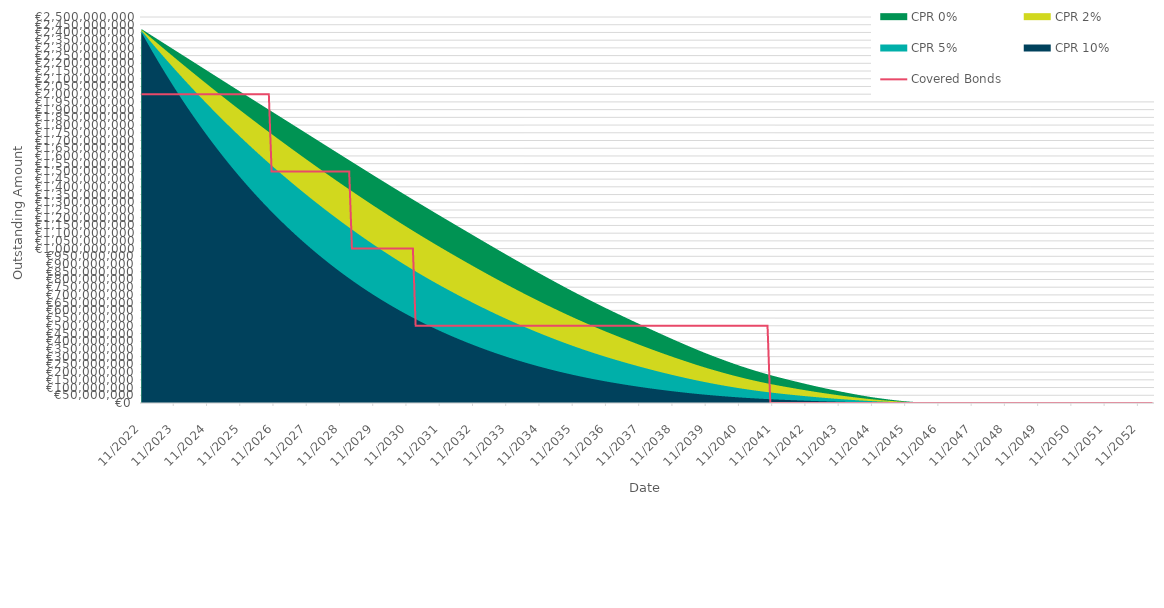
| Category | Covered Bonds |
|---|---|
| 2022-11-30 | 2000000000 |
| 2022-12-31 | 2000000000 |
| 2023-01-31 | 2000000000 |
| 2023-02-28 | 2000000000 |
| 2023-03-31 | 2000000000 |
| 2023-04-30 | 2000000000 |
| 2023-05-31 | 2000000000 |
| 2023-06-30 | 2000000000 |
| 2023-07-31 | 2000000000 |
| 2023-08-31 | 2000000000 |
| 2023-09-30 | 2000000000 |
| 2023-10-31 | 2000000000 |
| 2023-11-30 | 2000000000 |
| 2023-12-31 | 2000000000 |
| 2024-01-31 | 2000000000 |
| 2024-02-29 | 2000000000 |
| 2024-03-31 | 2000000000 |
| 2024-04-30 | 2000000000 |
| 2024-05-31 | 2000000000 |
| 2024-06-30 | 2000000000 |
| 2024-07-31 | 2000000000 |
| 2024-08-31 | 2000000000 |
| 2024-09-30 | 2000000000 |
| 2024-10-31 | 2000000000 |
| 2024-11-30 | 2000000000 |
| 2024-12-31 | 2000000000 |
| 2025-01-31 | 2000000000 |
| 2025-02-28 | 2000000000 |
| 2025-03-31 | 2000000000 |
| 2025-04-30 | 2000000000 |
| 2025-05-31 | 2000000000 |
| 2025-06-30 | 2000000000 |
| 2025-07-31 | 2000000000 |
| 2025-08-31 | 2000000000 |
| 2025-09-30 | 2000000000 |
| 2025-10-31 | 2000000000 |
| 2025-11-30 | 2000000000 |
| 2025-12-31 | 2000000000 |
| 2026-01-31 | 2000000000 |
| 2026-02-28 | 2000000000 |
| 2026-03-31 | 2000000000 |
| 2026-04-30 | 2000000000 |
| 2026-05-31 | 2000000000 |
| 2026-06-30 | 2000000000 |
| 2026-07-31 | 2000000000 |
| 2026-08-31 | 2000000000 |
| 2026-09-30 | 2000000000 |
| 2026-10-31 | 1500000000 |
| 2026-11-30 | 1500000000 |
| 2026-12-31 | 1500000000 |
| 2027-01-31 | 1500000000 |
| 2027-02-28 | 1500000000 |
| 2027-03-31 | 1500000000 |
| 2027-04-30 | 1500000000 |
| 2027-05-31 | 1500000000 |
| 2027-06-30 | 1500000000 |
| 2027-07-31 | 1500000000 |
| 2027-08-31 | 1500000000 |
| 2027-09-30 | 1500000000 |
| 2027-10-31 | 1500000000 |
| 2027-11-30 | 1500000000 |
| 2027-12-31 | 1500000000 |
| 2028-01-31 | 1500000000 |
| 2028-02-29 | 1500000000 |
| 2028-03-31 | 1500000000 |
| 2028-04-30 | 1500000000 |
| 2028-05-31 | 1500000000 |
| 2028-06-30 | 1500000000 |
| 2028-07-31 | 1500000000 |
| 2028-08-31 | 1500000000 |
| 2028-09-30 | 1500000000 |
| 2028-10-31 | 1500000000 |
| 2028-11-30 | 1500000000 |
| 2028-12-31 | 1500000000 |
| 2029-01-31 | 1500000000 |
| 2029-02-28 | 1500000000 |
| 2029-03-31 | 1000000000 |
| 2029-04-30 | 1000000000 |
| 2029-05-31 | 1000000000 |
| 2029-06-30 | 1000000000 |
| 2029-07-31 | 1000000000 |
| 2029-08-31 | 1000000000 |
| 2029-09-30 | 1000000000 |
| 2029-10-31 | 1000000000 |
| 2029-11-30 | 1000000000 |
| 2029-12-31 | 1000000000 |
| 2030-01-31 | 1000000000 |
| 2030-02-28 | 1000000000 |
| 2030-03-31 | 1000000000 |
| 2030-04-30 | 1000000000 |
| 2030-05-31 | 1000000000 |
| 2030-06-30 | 1000000000 |
| 2030-07-31 | 1000000000 |
| 2030-08-31 | 1000000000 |
| 2030-09-30 | 1000000000 |
| 2030-10-31 | 1000000000 |
| 2030-11-30 | 1000000000 |
| 2030-12-31 | 1000000000 |
| 2031-01-31 | 1000000000 |
| 2031-02-28 | 500000000 |
| 2031-03-31 | 500000000 |
| 2031-04-30 | 500000000 |
| 2031-05-31 | 500000000 |
| 2031-06-30 | 500000000 |
| 2031-07-31 | 500000000 |
| 2031-08-31 | 500000000 |
| 2031-09-30 | 500000000 |
| 2031-10-31 | 500000000 |
| 2031-11-30 | 500000000 |
| 2031-12-31 | 500000000 |
| 2032-01-31 | 500000000 |
| 2032-02-29 | 500000000 |
| 2032-03-31 | 500000000 |
| 2032-04-30 | 500000000 |
| 2032-05-31 | 500000000 |
| 2032-06-30 | 500000000 |
| 2032-07-31 | 500000000 |
| 2032-08-31 | 500000000 |
| 2032-09-30 | 500000000 |
| 2032-10-31 | 500000000 |
| 2032-11-30 | 500000000 |
| 2032-12-31 | 500000000 |
| 2033-01-31 | 500000000 |
| 2033-02-28 | 500000000 |
| 2033-03-31 | 500000000 |
| 2033-04-30 | 500000000 |
| 2033-05-31 | 500000000 |
| 2033-06-30 | 500000000 |
| 2033-07-31 | 500000000 |
| 2033-08-31 | 500000000 |
| 2033-09-30 | 500000000 |
| 2033-10-31 | 500000000 |
| 2033-11-30 | 500000000 |
| 2033-12-31 | 500000000 |
| 2034-01-31 | 500000000 |
| 2034-02-28 | 500000000 |
| 2034-03-31 | 500000000 |
| 2034-04-30 | 500000000 |
| 2034-05-31 | 500000000 |
| 2034-06-30 | 500000000 |
| 2034-07-31 | 500000000 |
| 2034-08-31 | 500000000 |
| 2034-09-30 | 500000000 |
| 2034-10-31 | 500000000 |
| 2034-11-30 | 500000000 |
| 2034-12-31 | 500000000 |
| 2035-01-31 | 500000000 |
| 2035-02-28 | 500000000 |
| 2035-03-31 | 500000000 |
| 2035-04-30 | 500000000 |
| 2035-05-31 | 500000000 |
| 2035-06-30 | 500000000 |
| 2035-07-31 | 500000000 |
| 2035-08-31 | 500000000 |
| 2035-09-30 | 500000000 |
| 2035-10-31 | 500000000 |
| 2035-11-30 | 500000000 |
| 2035-12-31 | 500000000 |
| 2036-01-31 | 500000000 |
| 2036-02-29 | 500000000 |
| 2036-03-31 | 500000000 |
| 2036-04-30 | 500000000 |
| 2036-05-31 | 500000000 |
| 2036-06-30 | 500000000 |
| 2036-07-31 | 500000000 |
| 2036-08-31 | 500000000 |
| 2036-09-30 | 500000000 |
| 2036-10-31 | 500000000 |
| 2036-11-30 | 500000000 |
| 2036-12-31 | 500000000 |
| 2037-01-31 | 500000000 |
| 2037-02-28 | 500000000 |
| 2037-03-31 | 500000000 |
| 2037-04-30 | 500000000 |
| 2037-05-31 | 500000000 |
| 2037-06-30 | 500000000 |
| 2037-07-31 | 500000000 |
| 2037-08-31 | 500000000 |
| 2037-09-30 | 500000000 |
| 2037-10-31 | 500000000 |
| 2037-11-30 | 500000000 |
| 2037-12-31 | 500000000 |
| 2038-01-31 | 500000000 |
| 2038-02-28 | 500000000 |
| 2038-03-31 | 500000000 |
| 2038-04-30 | 500000000 |
| 2038-05-31 | 500000000 |
| 2038-06-30 | 500000000 |
| 2038-07-31 | 500000000 |
| 2038-08-31 | 500000000 |
| 2038-09-30 | 500000000 |
| 2038-10-31 | 500000000 |
| 2038-11-30 | 500000000 |
| 2038-12-31 | 500000000 |
| 2039-01-31 | 500000000 |
| 2039-02-28 | 500000000 |
| 2039-03-31 | 500000000 |
| 2039-04-30 | 500000000 |
| 2039-05-31 | 500000000 |
| 2039-06-30 | 500000000 |
| 2039-07-31 | 500000000 |
| 2039-08-31 | 500000000 |
| 2039-09-30 | 500000000 |
| 2039-10-31 | 500000000 |
| 2039-11-30 | 500000000 |
| 2039-12-31 | 500000000 |
| 2040-01-31 | 500000000 |
| 2040-02-29 | 500000000 |
| 2040-03-31 | 500000000 |
| 2040-04-30 | 500000000 |
| 2040-05-31 | 500000000 |
| 2040-06-30 | 500000000 |
| 2040-07-31 | 500000000 |
| 2040-08-31 | 500000000 |
| 2040-09-30 | 500000000 |
| 2040-10-31 | 500000000 |
| 2040-11-30 | 500000000 |
| 2040-12-31 | 500000000 |
| 2041-01-31 | 500000000 |
| 2041-02-28 | 500000000 |
| 2041-03-31 | 500000000 |
| 2041-04-30 | 500000000 |
| 2041-05-31 | 500000000 |
| 2041-06-30 | 500000000 |
| 2041-07-31 | 500000000 |
| 2041-08-31 | 500000000 |
| 2041-09-30 | 500000000 |
| 2041-10-31 | 0 |
| 2041-11-30 | 0 |
| 2041-12-31 | 0 |
| 2042-01-31 | 0 |
| 2042-02-28 | 0 |
| 2042-03-31 | 0 |
| 2042-04-30 | 0 |
| 2042-05-31 | 0 |
| 2042-06-30 | 0 |
| 2042-07-31 | 0 |
| 2042-08-31 | 0 |
| 2042-09-30 | 0 |
| 2042-10-31 | 0 |
| 2042-11-30 | 0 |
| 2042-12-31 | 0 |
| 2043-01-31 | 0 |
| 2043-02-28 | 0 |
| 2043-03-31 | 0 |
| 2043-04-30 | 0 |
| 2043-05-31 | 0 |
| 2043-06-30 | 0 |
| 2043-07-31 | 0 |
| 2043-08-31 | 0 |
| 2043-09-30 | 0 |
| 2043-10-31 | 0 |
| 2043-11-30 | 0 |
| 2043-12-31 | 0 |
| 2044-01-31 | 0 |
| 2044-02-29 | 0 |
| 2044-03-31 | 0 |
| 2044-04-30 | 0 |
| 2044-05-31 | 0 |
| 2044-06-30 | 0 |
| 2044-07-31 | 0 |
| 2044-08-31 | 0 |
| 2044-09-30 | 0 |
| 2044-10-31 | 0 |
| 2044-11-30 | 0 |
| 2044-12-31 | 0 |
| 2045-01-31 | 0 |
| 2045-02-28 | 0 |
| 2045-03-31 | 0 |
| 2045-04-30 | 0 |
| 2045-05-31 | 0 |
| 2045-06-30 | 0 |
| 2045-07-31 | 0 |
| 2045-08-31 | 0 |
| 2045-09-30 | 0 |
| 2045-10-31 | 0 |
| 2045-11-30 | 0 |
| 2045-12-31 | 0 |
| 2046-01-31 | 0 |
| 2046-02-28 | 0 |
| 2046-03-31 | 0 |
| 2046-04-30 | 0 |
| 2046-05-31 | 0 |
| 2046-06-30 | 0 |
| 2046-07-31 | 0 |
| 2046-08-31 | 0 |
| 2046-09-30 | 0 |
| 2046-10-31 | 0 |
| 2046-11-30 | 0 |
| 2046-12-31 | 0 |
| 2047-01-31 | 0 |
| 2047-02-28 | 0 |
| 2047-03-31 | 0 |
| 2047-04-30 | 0 |
| 2047-05-31 | 0 |
| 2047-06-30 | 0 |
| 2047-07-31 | 0 |
| 2047-08-31 | 0 |
| 2047-09-30 | 0 |
| 2047-10-31 | 0 |
| 2047-11-30 | 0 |
| 2047-12-31 | 0 |
| 2048-01-31 | 0 |
| 2048-02-29 | 0 |
| 2048-03-31 | 0 |
| 2048-04-30 | 0 |
| 2048-05-31 | 0 |
| 2048-06-30 | 0 |
| 2048-07-31 | 0 |
| 2048-08-31 | 0 |
| 2048-09-30 | 0 |
| 2048-10-31 | 0 |
| 2048-11-30 | 0 |
| 2048-12-31 | 0 |
| 2049-01-31 | 0 |
| 2049-02-28 | 0 |
| 2049-03-31 | 0 |
| 2049-04-30 | 0 |
| 2049-05-31 | 0 |
| 2049-06-30 | 0 |
| 2049-07-31 | 0 |
| 2049-08-31 | 0 |
| 2049-09-30 | 0 |
| 2049-10-31 | 0 |
| 2049-11-30 | 0 |
| 2049-12-31 | 0 |
| 2050-01-31 | 0 |
| 2050-02-28 | 0 |
| 2050-03-31 | 0 |
| 2050-04-30 | 0 |
| 2050-05-31 | 0 |
| 2050-06-30 | 0 |
| 2050-07-31 | 0 |
| 2050-08-31 | 0 |
| 2050-09-30 | 0 |
| 2050-10-31 | 0 |
| 2050-11-30 | 0 |
| 2050-12-31 | 0 |
| 2051-01-31 | 0 |
| 2051-02-28 | 0 |
| 2051-03-31 | 0 |
| 2051-04-30 | 0 |
| 2051-05-31 | 0 |
| 2051-06-30 | 0 |
| 2051-07-31 | 0 |
| 2051-08-31 | 0 |
| 2051-09-30 | 0 |
| 2051-10-31 | 0 |
| 2051-11-30 | 0 |
| 2051-12-31 | 0 |
| 2052-01-31 | 0 |
| 2052-02-29 | 0 |
| 2052-03-31 | 0 |
| 2052-04-30 | 0 |
| 2052-05-31 | 0 |
| 2052-06-30 | 0 |
| 2052-07-31 | 0 |
| 2052-08-31 | 0 |
| 2052-09-30 | 0 |
| 2052-10-31 | 0 |
| 2052-11-30 | 0 |
| 2052-12-31 | 0 |
| 2053-01-31 | 0 |
| 2053-02-28 | 0 |
| 2053-03-31 | 0 |
| 2053-04-30 | 0 |